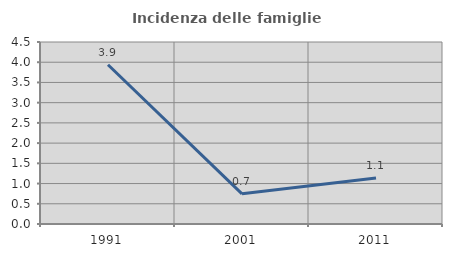
| Category | Incidenza delle famiglie numerose |
|---|---|
| 1991.0 | 3.938 |
| 2001.0 | 0.745 |
| 2011.0 | 1.138 |